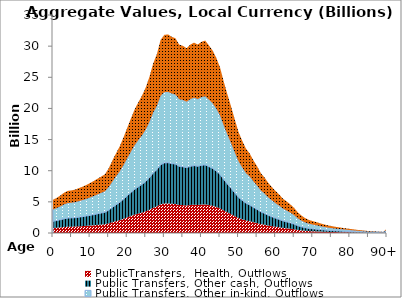
| Category | PublicTransfers,  Health, Outflows | Public Transfers, Other cash, Outflows | Public Transfers, Other in-kind, Outflows | Public Transfers, Education, Outflows |
|---|---|---|---|---|
| 0 | 793.886 | 1093.472 | 1902.19 | 1542.004 |
|  | 840.621 | 1157.843 | 2014.168 | 1632.779 |
| 2 | 897.363 | 1235.997 | 2150.125 | 1742.992 |
| 3 | 963.753 | 1327.441 | 2309.199 | 1871.945 |
| 4 | 1007.633 | 1387.879 | 2414.337 | 1957.174 |
| 5 | 1018.985 | 1403.516 | 2441.538 | 1979.225 |
| 6 | 1039.02 | 1431.11 | 2489.541 | 2018.138 |
| 7 | 1074.056 | 1479.369 | 2573.49 | 2086.191 |
| 8 | 1108.886 | 1527.342 | 2656.944 | 2153.843 |
| 9 | 1148.968 | 1582.549 | 2752.982 | 2231.695 |
| 10 | 1195.389 | 1646.488 | 2864.208 | 2321.861 |
| 11 | 1244.928 | 1714.722 | 2982.908 | 2418.084 |
| 12 | 1298.304 | 1788.24 | 3110.798 | 2521.758 |
| 13 | 1350.261 | 1859.804 | 3235.291 | 2622.678 |
| 14 | 1403.921 | 1933.713 | 3363.862 | 2726.903 |
| 15 | 1544.75 | 2127.686 | 3701.295 | 3000.442 |
| 16 | 1731.233 | 2384.541 | 4148.117 | 3362.657 |
| 17 | 1907.347 | 2627.114 | 4570.094 | 3704.731 |
| 18 | 2075.674 | 2858.963 | 4973.415 | 4031.682 |
| 19 | 2286.165 | 3148.886 | 5477.761 | 4440.529 |
| 20 | 2513.263 | 3461.684 | 6021.9 | 4881.633 |
| 21 | 2738.541 | 3771.974 | 6561.677 | 5319.201 |
| 22 | 2954.772 | 4069.803 | 7079.776 | 5739.197 |
| 23 | 3125.492 | 4304.947 | 7488.83 | 6070.795 |
| 24 | 3287.144 | 4527.6 | 7876.154 | 6384.778 |
| 25 | 3480.726 | 4794.234 | 8339.986 | 6760.782 |
| 26 | 3737.635 | 5148.092 | 8955.553 | 7259.789 |
| 27 | 4055.43 | 5585.812 | 9717.005 | 7877.058 |
| 28 | 4279.576 | 5894.543 | 10254.07 | 8312.428 |
| 29 | 4617.357 | 6359.791 | 11063.41 | 8968.516 |
| 30 | 4736.298 | 6523.617 | 11348.398 | 9199.541 |
| 31 | 4748.531 | 6540.466 | 11377.708 | 9223.301 |
| 32 | 4690.159 | 6460.066 | 11237.847 | 9109.923 |
| 33 | 4654.495 | 6410.943 | 11152.392 | 9040.65 |
| 34 | 4503.659 | 6203.188 | 10790.984 | 8747.675 |
| 35 | 4475.456 | 6164.342 | 10723.408 | 8692.895 |
| 36 | 4417.207 | 6084.111 | 10583.84 | 8579.755 |
| 37 | 4502.248 | 6201.244 | 10787.604 | 8744.935 |
| 38 | 4552.334 | 6270.231 | 10907.612 | 8842.219 |
| 39 | 4505.386 | 6205.566 | 10795.122 | 8751.029 |
| 40 | 4570.113 | 6294.719 | 10950.211 | 8876.752 |
| 41 | 4601.192 | 6337.526 | 11024.677 | 8937.118 |
| 42 | 4487.429 | 6180.833 | 10752.096 | 8716.15 |
| 43 | 4363.927 | 6010.725 | 10456.179 | 8476.267 |
| 44 | 4186.886 | 5766.874 | 10031.979 | 8132.39 |
| 45 | 3962.24 | 5457.455 | 9493.717 | 7696.05 |
| 46 | 3621.344 | 4987.917 | 8676.914 | 7033.912 |
| 47 | 3313.322 | 4563.658 | 7938.879 | 6435.626 |
| 48 | 3019.33 | 4158.722 | 7234.459 | 5864.59 |
| 49 | 2708.267 | 3730.276 | 6489.139 | 5260.399 |
| 50 | 2412.367 | 3322.713 | 5780.148 | 4685.657 |
| 51 | 2203.082 | 3034.45 | 5278.689 | 4279.152 |
| 52 | 2016.376 | 2777.288 | 4831.333 | 3916.504 |
| 53 | 1901.419 | 2618.951 | 4555.892 | 3693.219 |
| 54 | 1736.687 | 2392.053 | 4161.185 | 3373.25 |
| 55 | 1595.089 | 2197.021 | 3821.909 | 3098.218 |
| 56 | 1430.818 | 1970.76 | 3428.308 | 2779.146 |
| 57 | 1327.422 | 1828.347 | 3180.568 | 2578.317 |
| 58 | 1198.812 | 1651.203 | 2872.411 | 2328.51 |
| 59 | 1096.565 | 1510.371 | 2627.422 | 2129.911 |
| 60 | 1000.888 | 1378.589 | 2398.175 | 1944.073 |
| 61 | 914.637 | 1259.79 | 2191.514 | 1776.543 |
| 62 | 817.98 | 1126.657 | 1959.918 | 1588.801 |
| 63 | 752.346 | 1036.255 | 1802.656 | 1461.317 |
| 64 | 680.461 | 937.244 | 1630.418 | 1321.693 |
| 65 | 598.659 | 824.573 | 1434.417 | 1162.805 |
| 66 | 489.646 | 674.422 | 1173.215 | 951.063 |
| 67 | 413.822 | 569.984 | 991.537 | 803.786 |
| 68 | 352.857 | 486.013 | 845.462 | 685.371 |
| 69 | 310.923 | 428.255 | 744.986 | 603.921 |
| 70 | 284.445 | 391.785 | 681.544 | 552.491 |
| 71 | 258.905 | 356.607 | 620.349 | 502.884 |
| 72 | 231.692 | 319.125 | 555.145 | 450.026 |
| 73 | 206.372 | 284.25 | 494.477 | 400.846 |
| 74 | 184.126 | 253.609 | 441.175 | 357.637 |
| 75 | 166.761 | 229.691 | 399.568 | 323.909 |
| 76 | 149.655 | 206.13 | 358.58 | 290.682 |
| 77 | 136.418 | 187.898 | 326.864 | 264.971 |
| 78 | 122.873 | 169.241 | 294.41 | 238.662 |
| 79 | 109.721 | 151.125 | 262.896 | 213.116 |
| 80 | 98.036 | 135.031 | 234.898 | 190.419 |
| 81 | 87.417 | 120.406 | 209.456 | 169.795 |
| 82 | 75.433 | 103.899 | 180.741 | 146.517 |
| 83 | 65.328 | 89.981 | 156.529 | 126.89 |
| 84 | 55.929 | 77.034 | 134.008 | 108.633 |
| 85 | 47.011 | 64.751 | 112.641 | 91.312 |
| 86 | 38.826 | 53.478 | 93.03 | 75.414 |
| 87 | 33.006 | 45.462 | 79.085 | 64.11 |
| 88 | 28.811 | 39.683 | 69.032 | 55.961 |
| 89 | 25.316 | 34.87 | 60.659 | 49.173 |
| 90+ | 107.407 | 147.939 | 257.353 | 208.622 |